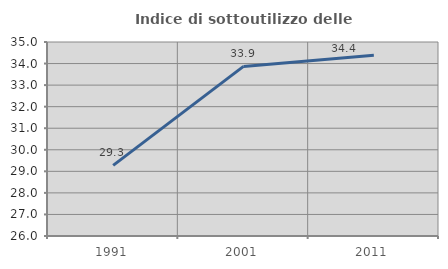
| Category | Indice di sottoutilizzo delle abitazioni  |
|---|---|
| 1991.0 | 29.279 |
| 2001.0 | 33.869 |
| 2011.0 | 34.384 |